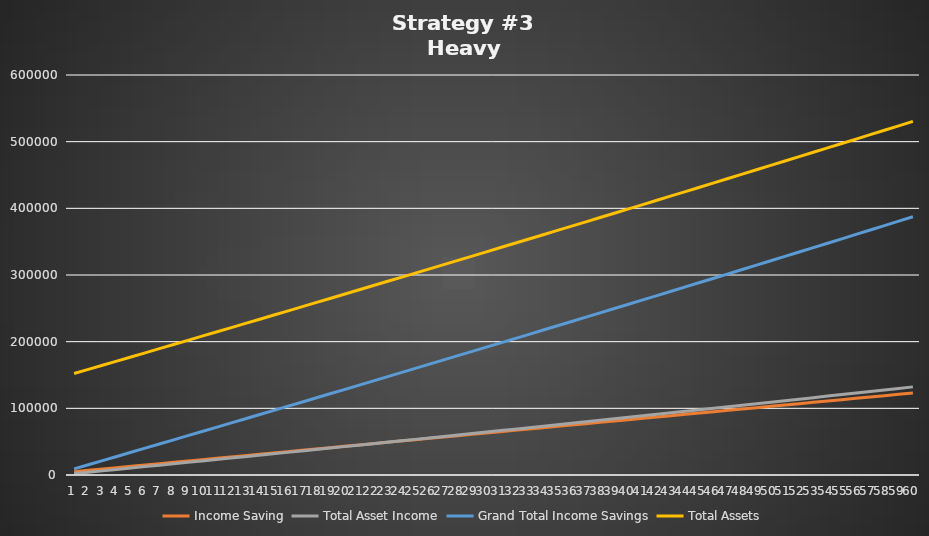
| Category | Income Saving | Total Asset Income | Grand Total Income Savings | Total Assets |
|---|---|---|---|---|
| 0 | 5001.705 | 2096.604 | 9194.913 | 152194.913 |
| 1 | 7001.754 | 4196.464 | 15394.681 | 158394.681 |
| 2 | 9001.803 | 6299.596 | 21600.995 | 164600.995 |
| 3 | 11001.852 | 8406.019 | 27813.889 | 170813.889 |
| 4 | 13001.901 | 10515.749 | 34033.398 | 177033.398 |
| 5 | 15001.95 | 12628.804 | 40259.557 | 183259.557 |
| 6 | 17001.999 | 14745.202 | 46492.402 | 189492.402 |
| 7 | 19002.048 | 16864.96 | 52731.968 | 195731.968 |
| 8 | 21002.097 | 18988.097 | 58978.291 | 201978.291 |
| 9 | 23002.146 | 21114.63 | 65231.406 | 208231.406 |
| 10 | 25002.195 | 23244.577 | 71491.35 | 214491.35 |
| 11 | 27002.244 | 25377.957 | 77758.159 | 220758.159 |
| 12 | 29002.294 | 27514.788 | 84031.869 | 227031.869 |
| 13 | 31002.343 | 29655.087 | 90312.517 | 233312.517 |
| 14 | 33002.392 | 31798.874 | 96600.139 | 239600.139 |
| 15 | 35002.441 | 33946.167 | 102894.774 | 245894.774 |
| 16 | 37002.49 | 36096.984 | 109196.458 | 252196.458 |
| 17 | 39002.539 | 38251.344 | 115505.228 | 258505.228 |
| 18 | 41002.588 | 40409.267 | 121821.122 | 264821.122 |
| 19 | 43002.637 | 42570.771 | 128144.178 | 271144.178 |
| 20 | 45002.686 | 44735.874 | 134474.434 | 277474.434 |
| 21 | 47002.735 | 46904.596 | 140811.928 | 283811.928 |
| 22 | 49002.784 | 49076.957 | 147156.699 | 290156.699 |
| 23 | 51002.833 | 51252.976 | 153508.785 | 296508.785 |
| 24 | 53002.882 | 53432.671 | 159868.224 | 302868.224 |
| 25 | 55002.932 | 55616.063 | 166235.057 | 309235.057 |
| 26 | 57002.981 | 57803.171 | 172609.323 | 315609.323 |
| 27 | 59003.03 | 59994.015 | 178991.059 | 321991.059 |
| 28 | 61003.079 | 62188.614 | 185380.308 | 328380.308 |
| 29 | 63003.128 | 64386.99 | 191777.107 | 334777.107 |
| 30 | 65003.177 | 66589.161 | 198181.498 | 341181.498 |
| 31 | 67003.226 | 68795.147 | 204593.521 | 347593.521 |
| 32 | 69003.275 | 71004.97 | 211013.216 | 354013.216 |
| 33 | 71003.324 | 73218.65 | 217440.623 | 360440.623 |
| 34 | 73003.373 | 75436.206 | 223875.785 | 366875.785 |
| 35 | 75003.422 | 77657.66 | 230318.741 | 373318.741 |
| 36 | 77003.471 | 79883.031 | 236769.534 | 379769.534 |
| 37 | 79003.52 | 82112.342 | 243228.205 | 386228.205 |
| 38 | 81003.57 | 84345.613 | 249694.796 | 392694.796 |
| 39 | 83003.619 | 86582.865 | 256169.348 | 399169.348 |
| 40 | 85003.668 | 88824.119 | 262651.905 | 405651.905 |
| 41 | 87003.717 | 91069.396 | 269142.508 | 412142.508 |
| 42 | 89003.766 | 93318.717 | 275641.201 | 418641.201 |
| 43 | 91003.815 | 95572.105 | 282148.025 | 425148.025 |
| 44 | 93003.864 | 97829.581 | 288663.025 | 431663.025 |
| 45 | 95003.913 | 100091.166 | 295186.244 | 438186.244 |
| 46 | 97003.962 | 102356.882 | 301717.726 | 444717.726 |
| 47 | 99004.011 | 104626.751 | 308257.514 | 451257.514 |
| 48 | 101004.06 | 106900.796 | 314805.652 | 457805.652 |
| 49 | 103004.109 | 109179.038 | 321362.184 | 464362.184 |
| 50 | 105004.158 | 111461.499 | 327927.156 | 470927.156 |
| 51 | 107004.207 | 113748.203 | 334500.613 | 477500.613 |
| 52 | 109004.257 | 116039.171 | 341082.598 | 484082.598 |
| 53 | 111004.306 | 118334.426 | 347673.158 | 490673.158 |
| 54 | 113004.355 | 120633.991 | 354272.337 | 497272.337 |
| 55 | 115004.404 | 122937.889 | 360880.182 | 503880.182 |
| 56 | 117004.453 | 125246.143 | 367496.739 | 510496.739 |
| 57 | 119004.502 | 127558.776 | 374122.054 | 517122.054 |
| 58 | 121004.551 | 129875.811 | 380756.173 | 523756.173 |
| 59 | 123004.6 | 132197.272 | 387399.144 | 530399.144 |